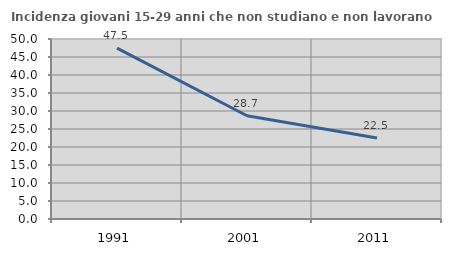
| Category | Incidenza giovani 15-29 anni che non studiano e non lavorano  |
|---|---|
| 1991.0 | 47.479 |
| 2001.0 | 28.686 |
| 2011.0 | 22.515 |